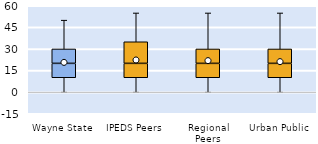
| Category | 25th | 50th | 75th |
|---|---|---|---|
| Wayne State | 10 | 10 | 10 |
| IPEDS Peers | 10 | 10 | 15 |
| Regional Peers | 10 | 10 | 10 |
| Urban Public | 10 | 10 | 10 |